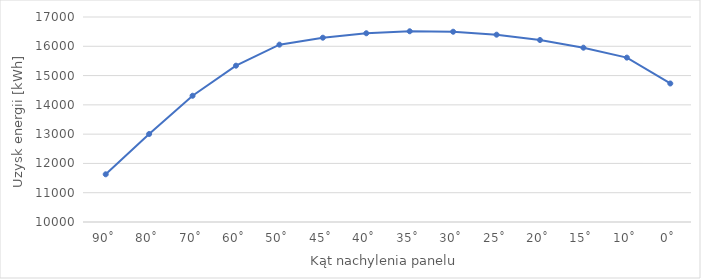
| Category | Roczna produkcja [kWh] |
|---|---|
| 90˚ | 11629 |
| 80˚ | 13005 |
| 70˚ | 14311 |
| 60˚ | 15338 |
| 50˚ | 16056 |
| 45˚ | 16293 |
| 40˚ | 16445 |
| 35˚ | 16513 |
| 30˚ | 16497 |
| 25˚ | 16396 |
| 20˚ | 16214 |
| 15˚ | 15952 |
| 10˚ | 15613 |
| 0˚ | 14730 |